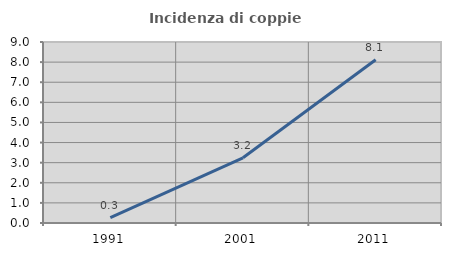
| Category | Incidenza di coppie miste |
|---|---|
| 1991.0 | 0.262 |
| 2001.0 | 3.243 |
| 2011.0 | 8.116 |